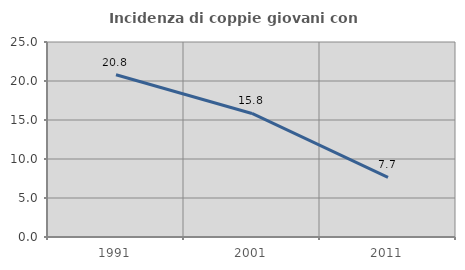
| Category | Incidenza di coppie giovani con figli |
|---|---|
| 1991.0 | 20.803 |
| 2001.0 | 15.839 |
| 2011.0 | 7.656 |